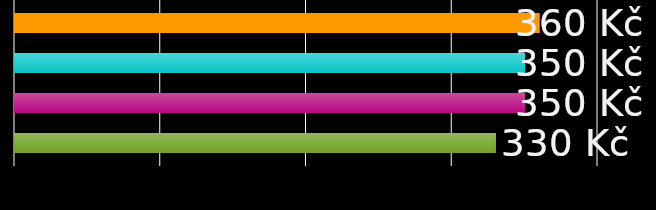
| Category | spolubydlící 1 | spolubydlící 2 | spolubydlící 3 | spolubydlící 4 |
|---|---|---|---|---|
| 0 | 360 | 350 | 350 | 330 |